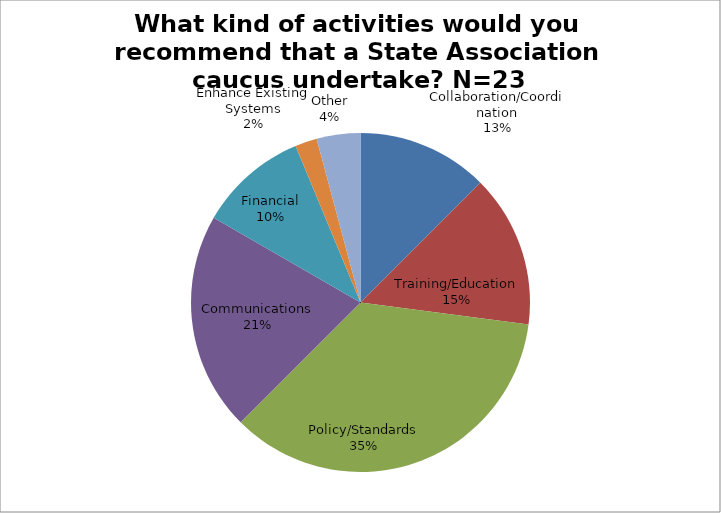
| Category | What kind of activities would you recommend that a State Association caucus undertake? N=23 |
|---|---|
| Collaboration/Coordination | 6 |
| Training/Education | 7 |
| Policy/Standards | 17 |
| Communications | 10 |
| Financial | 5 |
| Enhance Existing Systems | 1 |
| Other | 2 |